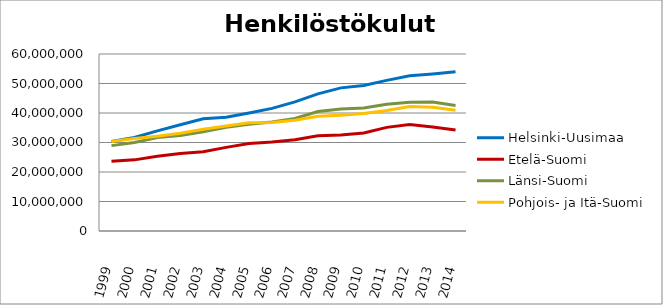
| Category | Helsinki-Uusimaa | Etelä-Suomi | Länsi-Suomi | Pohjois- ja Itä-Suomi |
|---|---|---|---|---|
| 1999.0 | 30343632.15 | 23642850.87 | 28940708.25 | 30306665.81 |
| 2000.0 | 31683577.96 | 24115985.59 | 29984783.07 | 31318456.92 |
| 2001.0 | 33927186.25 | 25357804.23 | 31655929.72 | 32139367.16 |
| 2002.0 | 36039527 | 26235974 | 32341518 | 33103619 |
| 2003.0 | 38072095 | 26888882 | 33627973 | 34505231 |
| 2004.0 | 38532228 | 28349246 | 35154582 | 35586050 |
| 2005.0 | 39994342 | 29691899 | 36203285 | 36714909 |
| 2006.0 | 41567024 | 30210030 | 36976963 | 36815588 |
| 2007.0 | 43778141 | 30947237 | 38125213 | 37524541 |
| 2008.0 | 46481704 | 32319963.21 | 40478495.9 | 38919422.01 |
| 2009.0 | 48515422.08 | 32533632.1 | 41333074.78 | 39278103.32 |
| 2010.0 | 49304289.96 | 33254966.95 | 41664219.18 | 39865282.44 |
| 2011.0 | 51068687.23 | 35125994.04 | 42988946.49 | 40878626.66 |
| 2012.0 | 52644983.1 | 36088358.21 | 43636639.7 | 42220450.03 |
| 2013.0 | 53246959.11 | 35285864.96 | 43751029.2 | 41938461.48 |
| 2014.0 | 53964950.42 | 34273752.96 | 42544604.26 | 40937956.53 |